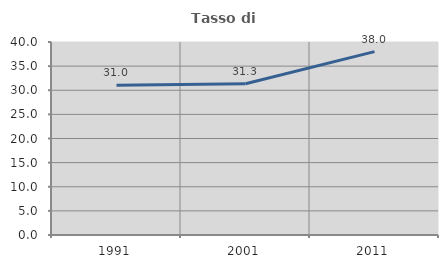
| Category | Tasso di occupazione   |
|---|---|
| 1991.0 | 31.034 |
| 2001.0 | 31.349 |
| 2011.0 | 38 |